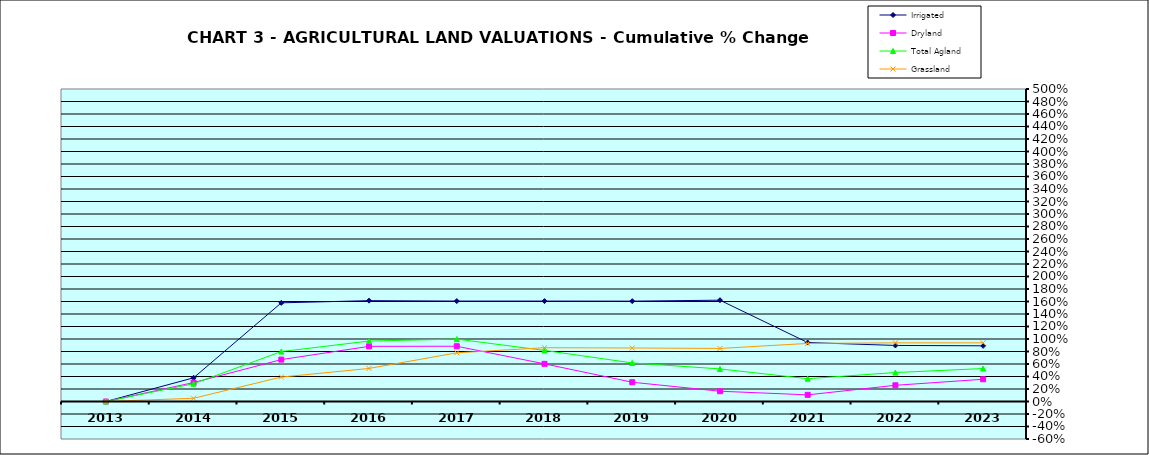
| Category | Irrigated | Dryland | Total Agland | Grassland |
|---|---|---|---|---|
| 2013.0 | 0 | 0 | 0 | 0 |
| 2014.0 | 0.379 | 0.303 | 0.284 | 0.052 |
| 2015.0 | 1.579 | 0.67 | 0.799 | 0.391 |
| 2016.0 | 1.614 | 0.882 | 0.967 | 0.529 |
| 2017.0 | 1.607 | 0.884 | 0.999 | 0.779 |
| 2018.0 | 1.607 | 0.602 | 0.817 | 0.861 |
| 2019.0 | 1.606 | 0.308 | 0.617 | 0.856 |
| 2020.0 | 1.621 | 0.164 | 0.521 | 0.849 |
| 2021.0 | 0.943 | 0.106 | 0.365 | 0.929 |
| 2022.0 | 0.897 | 0.259 | 0.463 | 0.938 |
| 2023.0 | 0.891 | 0.356 | 0.527 | 0.939 |